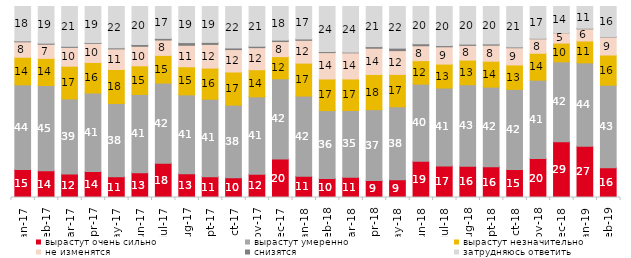
| Category | вырастут очень сильно | вырастут умеренно | вырастут незначительно | не изменятся | снизятся | затрудняюсь ответить |
|---|---|---|---|---|---|---|
| 2017-01-01 | 14.65 | 44.35 | 14.45 | 8.05 | 0.5 | 18 |
| 2017-02-01 | 13.95 | 44.7 | 14.2 | 7.4 | 0.55 | 19.2 |
| 2017-03-01 | 12.25 | 39.35 | 17.15 | 9.85 | 0.55 | 20.85 |
| 2017-04-01 | 13.55 | 41.15 | 16 | 9.95 | 0.4 | 18.95 |
| 2017-05-01 | 10.9 | 38.3 | 17.8 | 10.8 | 0.55 | 21.65 |
| 2017-06-01 | 13 | 40.95 | 15 | 10.2 | 0.95 | 19.9 |
| 2017-07-01 | 17.95 | 41.95 | 14.5 | 8.05 | 0.85 | 16.7 |
| 2017-08-01 | 12.5 | 41.25 | 14.7 | 11.25 | 1.4 | 18.9 |
| 2017-09-01 | 10.9 | 40.55 | 16.3 | 12.4 | 1.05 | 18.8 |
| 2017-10-01 | 10.4 | 37.95 | 17.35 | 11.75 | 0.85 | 21.7 |
| 2017-11-01 | 12.2 | 40.5 | 14.2 | 11.55 | 0.75 | 20.8 |
| 2017-12-01 | 20.1 | 42.05 | 11.6 | 7.9 | 0.75 | 17.6 |
| 2018-01-01 | 11.1 | 42 | 17.25 | 11.95 | 0.7 | 17 |
| 2018-02-01 | 10 | 35.5 | 16.55 | 13.8 | 0.55 | 23.6 |
| 2018-03-01 | 10.65 | 34.9 | 16.5 | 13.7 | 0.35 | 23.9 |
| 2018-04-01 | 8.95 | 37.05 | 18.4 | 13.75 | 0.85 | 21 |
| 2018-05-01 | 9.3 | 38.2 | 16.95 | 12.45 | 1.3 | 21.8 |
| 2018-06-01 | 18.95 | 40.4 | 12.3 | 7.8 | 1.05 | 19.5 |
| 2018-07-01 | 16.55 | 40.75 | 12.55 | 9.05 | 0.65 | 20.45 |
| 2018-08-01 | 16.35 | 42.7 | 12.9 | 7.7 | 0.65 | 19.7 |
| 2018-09-01 | 16.05 | 41.75 | 13.55 | 8.4 | 0.65 | 19.6 |
| 2018-10-01 | 14.6 | 42 | 12.8 | 9 | 0.4 | 21.2 |
| 2018-11-01 | 20.359 | 41.068 | 14.072 | 7.585 | 0.25 | 16.667 |
| 2018-12-01 | 29.25 | 41.8 | 9.8 | 5.4 | 0.1 | 13.65 |
| 2019-01-01 | 26.85 | 43.65 | 11.45 | 6.35 | 0.3 | 11.4 |
| 2019-02-01 | 15.6 | 43.2 | 15.8 | 9.35 | 0.15 | 15.9 |